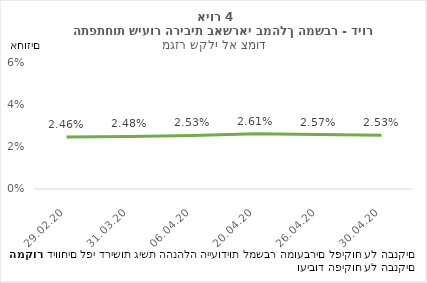
| Category | דיור |
|---|---|
| 29.02.20 | 0.025 |
| 31.03.20 | 0.025 |
| 06.04.20 | 0.025 |
| 20.04.20 | 0.026 |
| 26.04.20 | 0.026 |
| 30.04.20 | 0.025 |